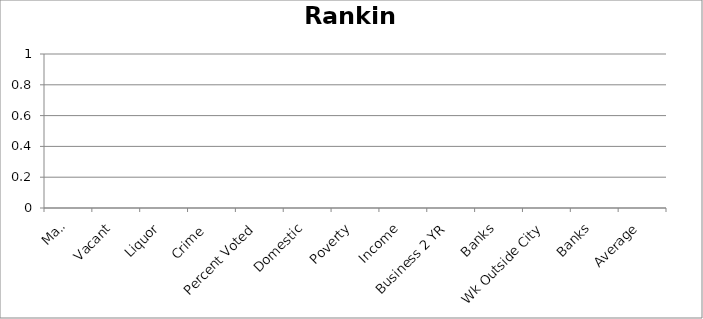
| Category | Ranking |
|---|---|
| Mail | 0 |
| Vacant | 0 |
| Liquor | 0 |
| Crime  | 0 |
| Percent Voted | 0 |
| Domestic | 0 |
| Poverty | 0 |
| Income | 0 |
| Business 2 YR | 0 |
| Banks | 0 |
| Wk Outside City | 0 |
| Banks | 0 |
| Average | 0 |